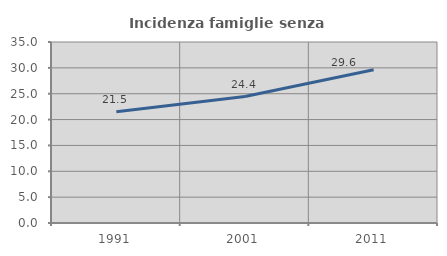
| Category | Incidenza famiglie senza nuclei |
|---|---|
| 1991.0 | 21.533 |
| 2001.0 | 24.449 |
| 2011.0 | 29.623 |